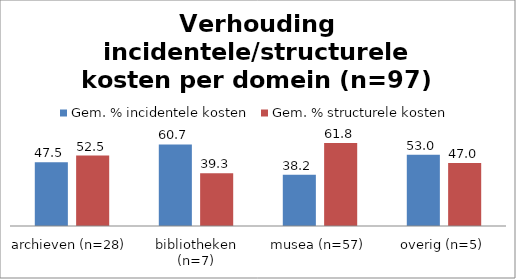
| Category | Gem. % incidentele kosten | Gem. % structurele kosten |
|---|---|---|
| archieven (n=28) | 47.5 | 52.5 |
| bibliotheken (n=7) | 60.714 | 39.286 |
| musea (n=57) | 38.193 | 61.807 |
| overig (n=5) | 53 | 47 |